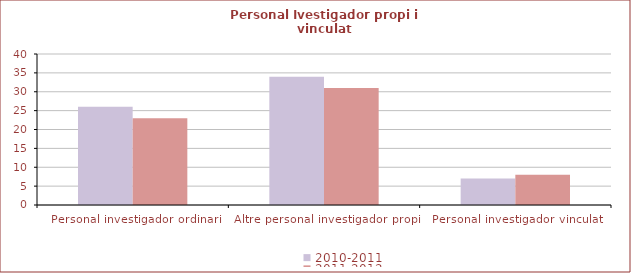
| Category | 2010-2011 | 2011-2012 |
|---|---|---|
| Personal investigador ordinari | 26 | 23 |
| Altre personal investigador propi | 34 | 31 |
| Personal investigador vinculat | 7 | 8 |